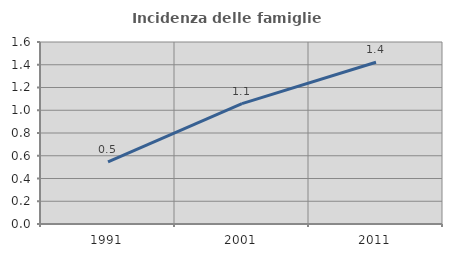
| Category | Incidenza delle famiglie numerose |
|---|---|
| 1991.0 | 0.546 |
| 2001.0 | 1.058 |
| 2011.0 | 1.422 |